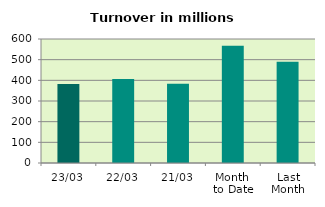
| Category | Series 0 |
|---|---|
| 23/03 | 382.636 |
| 22/03 | 406.253 |
| 21/03 | 383.779 |
| Month 
to Date | 566.933 |
| Last
Month | 490.433 |